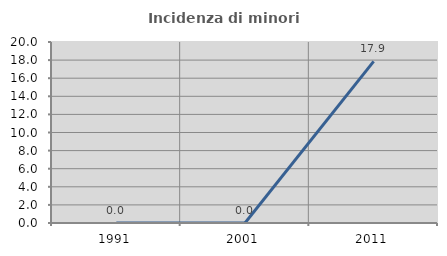
| Category | Incidenza di minori stranieri |
|---|---|
| 1991.0 | 0 |
| 2001.0 | 0 |
| 2011.0 | 17.857 |